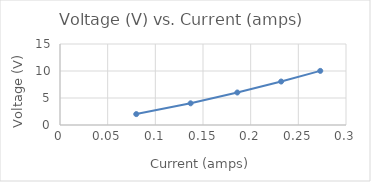
| Category | Voltage (V) |
|---|---|
| 0.08 | 2.018 |
| 0.137 | 4.015 |
| 0.186 | 6.018 |
| 0.232 | 8.05 |
| 0.273 | 10.02 |